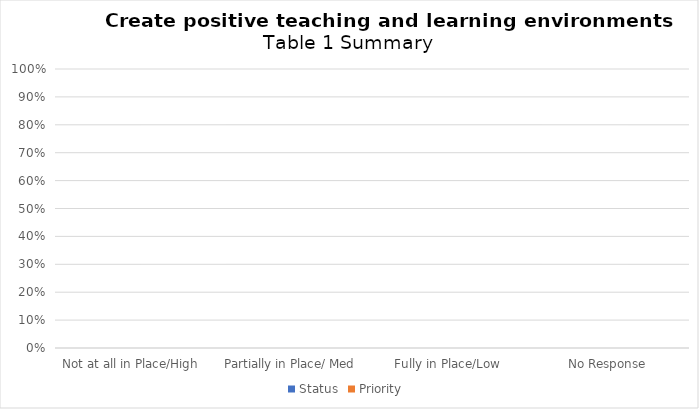
| Category | Status | Priority  |
|---|---|---|
| Not at all in Place/High  | 0 | 0 |
| Partially in Place/ Med | 0 | 0 |
| Fully in Place/Low  | 0 | 0 |
| No Response | 0 | 0 |